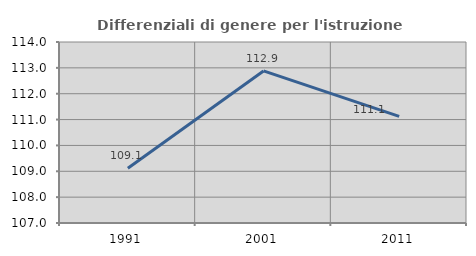
| Category | Differenziali di genere per l'istruzione superiore |
|---|---|
| 1991.0 | 109.115 |
| 2001.0 | 112.881 |
| 2011.0 | 111.121 |